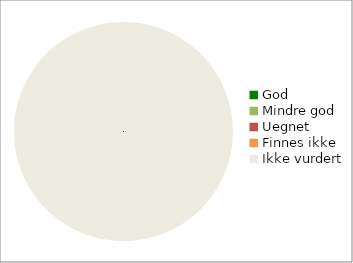
| Category | Series 0 |
|---|---|
| God | 0 |
| Mindre god | 0 |
| Uegnet | 0 |
| Finnes ikke | 0 |
| Ikke vurdert | 176 |